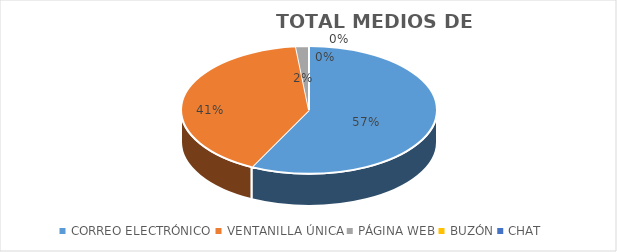
| Category | Series 0 |
|---|---|
| CORREO ELECTRÓNICO | 70 |
| VENTANILLA ÚNICA | 50 |
| PÁGINA WEB | 2 |
| BUZÓN | 0 |
| CHAT | 0 |